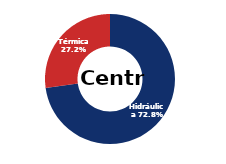
| Category | Centro |
|---|---|
| Eólica | 0 |
| Hidráulica | 2812.137 |
| Solar | 0.006 |
| Térmica | 1050.784 |